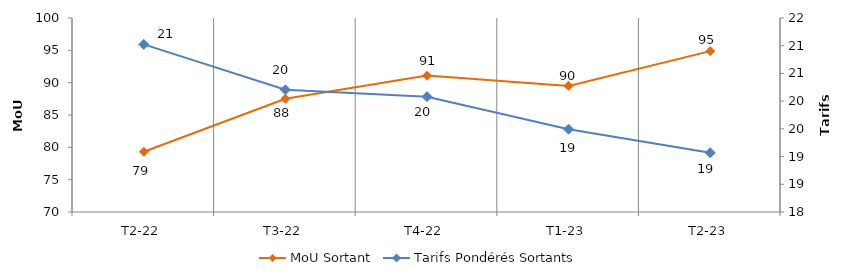
| Category | MoU Sortant |
|---|---|
| T2-22 | 79.316 |
| T3-22 | 87.52 |
| T4-22 | 91.091 |
| T1-23 | 89.502 |
| T2-23 | 94.878 |